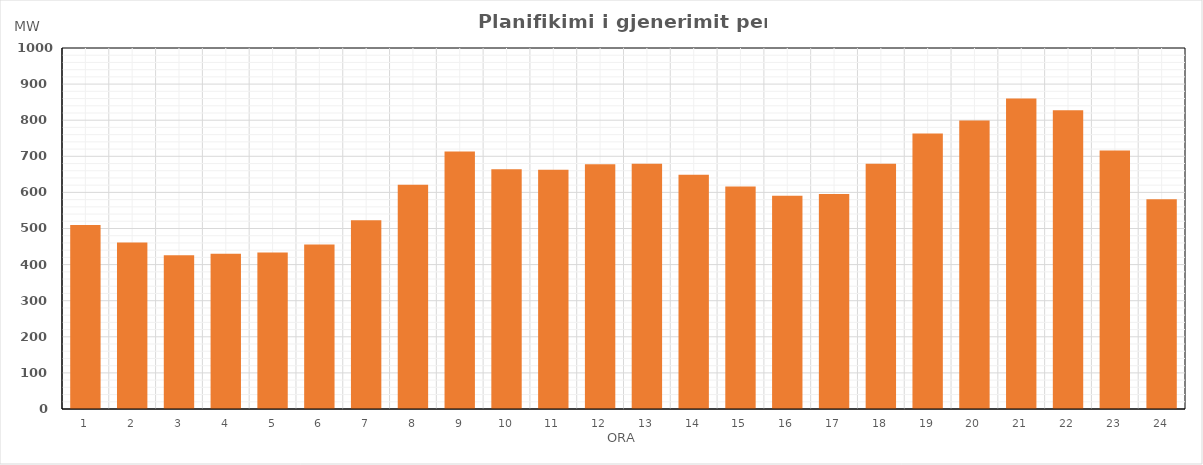
| Category | Max (MW) |
|---|---|
| 0 | 509.93 |
| 1 | 461.42 |
| 2 | 426.13 |
| 3 | 429.73 |
| 4 | 433.73 |
| 5 | 455.65 |
| 6 | 523.13 |
| 7 | 621.01 |
| 8 | 713.34 |
| 9 | 664.04 |
| 10 | 662.97 |
| 11 | 678.25 |
| 12 | 679.12 |
| 13 | 648.73 |
| 14 | 616.13 |
| 15 | 591.06 |
| 16 | 595.84 |
| 17 | 679.36 |
| 18 | 763.16 |
| 19 | 799.4 |
| 20 | 860.34 |
| 21 | 827.44 |
| 22 | 715.77 |
| 23 | 580.97 |